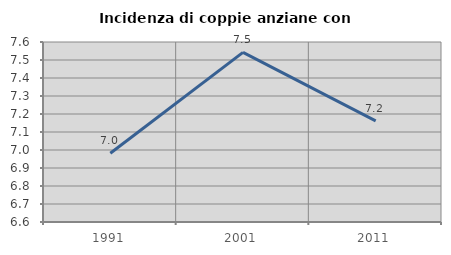
| Category | Incidenza di coppie anziane con figli |
|---|---|
| 1991.0 | 6.982 |
| 2001.0 | 7.543 |
| 2011.0 | 7.162 |